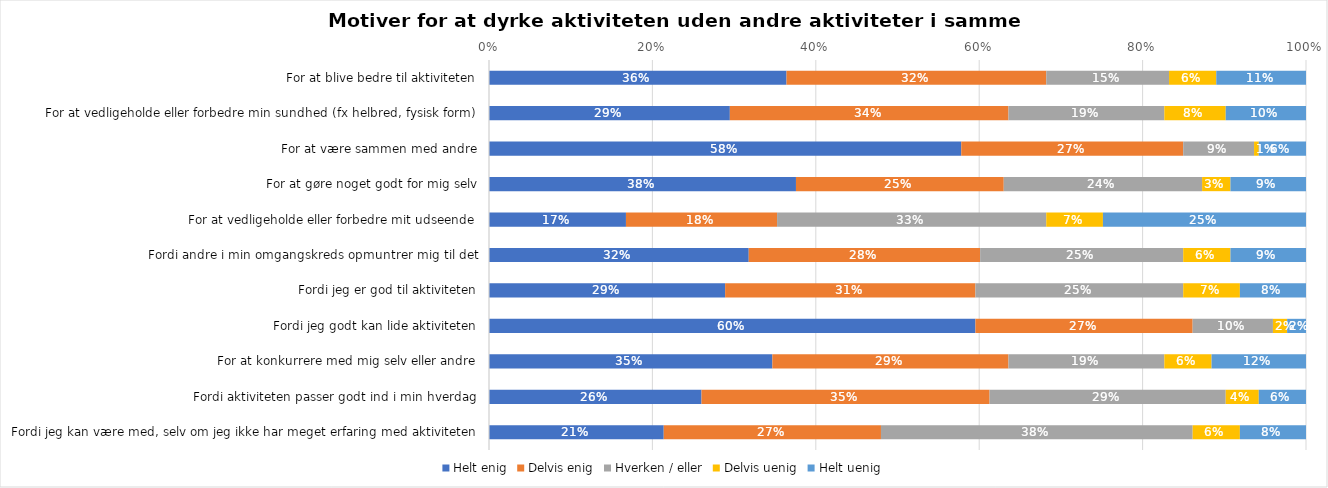
| Category | Helt enig | Delvis enig | Hverken / eller | Delvis uenig | Helt uenig |
|---|---|---|---|---|---|
| For at blive bedre til aktiviteten | 0.364 | 0.318 | 0.15 | 0.058 | 0.11 |
| For at vedligeholde eller forbedre min sundhed (fx helbred, fysisk form) | 0.295 | 0.341 | 0.191 | 0.075 | 0.098 |
| For at være sammen med andre | 0.578 | 0.272 | 0.087 | 0.006 | 0.058 |
| For at gøre noget godt for mig selv | 0.376 | 0.254 | 0.243 | 0.035 | 0.092 |
| For at vedligeholde eller forbedre mit udseende | 0.168 | 0.185 | 0.329 | 0.069 | 0.249 |
| Fordi andre i min omgangskreds opmuntrer mig til det | 0.318 | 0.283 | 0.249 | 0.058 | 0.092 |
| Fordi jeg er god til aktiviteten | 0.289 | 0.306 | 0.254 | 0.069 | 0.081 |
| Fordi jeg godt kan lide aktiviteten | 0.595 | 0.266 | 0.098 | 0.017 | 0.023 |
| For at konkurrere med mig selv eller andre | 0.347 | 0.289 | 0.191 | 0.058 | 0.116 |
| Fordi aktiviteten passer godt ind i min hverdag | 0.26 | 0.353 | 0.289 | 0.04 | 0.058 |
| Fordi jeg kan være med, selv om jeg ikke har meget erfaring med aktiviteten | 0.214 | 0.266 | 0.382 | 0.058 | 0.081 |